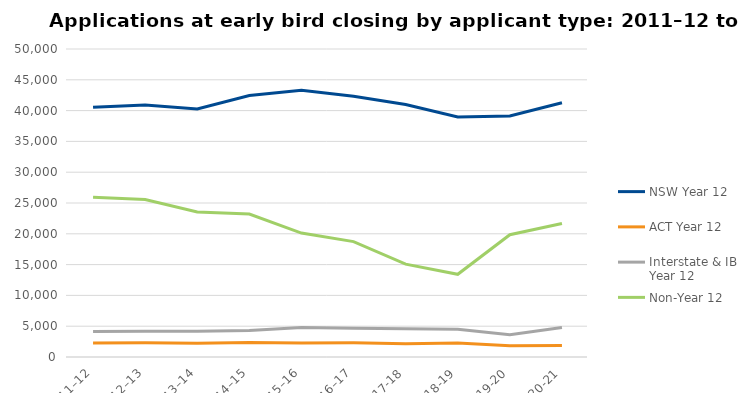
| Category | NSW Year 12 | ACT Year 12 | Interstate & IB Year 12 | Non-Year 12 |
|---|---|---|---|---|
| 2011–12 | 40535 | 2280 | 4137 | 25949 |
| 2012–13 | 40895 | 2308 | 4195 | 25567 |
| 2013–14 | 40264 | 2216 | 4168 | 23542 |
| 2014–15 | 42458 | 2365 | 4318 | 23202 |
| 2015–16 | 43303 | 2288 | 4783 | 20115 |
| 2016–17 | 42339 | 2306 | 4670 | 18727 |
| 2017-18 | 40989 | 2168 | 4599 | 15071 |
| 2018-19 | 38964 | 2263 | 4492 | 13424 |
| 2019-20 | 39132 | 1844 | 3620 | 19847 |
| 2020-21 | 41287 | 1874 | 4780 | 21661 |